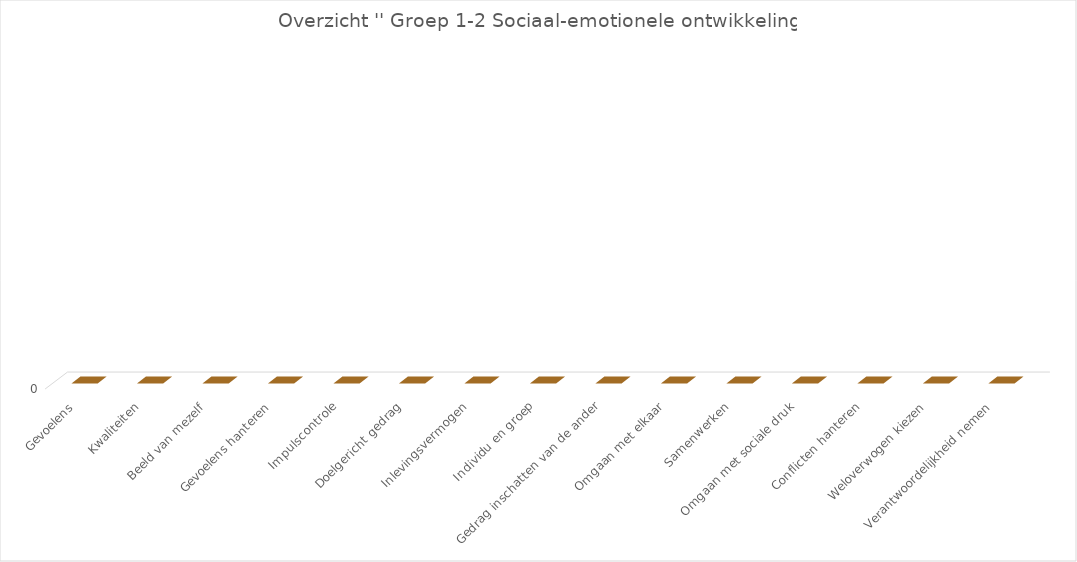
| Category | Series 2 |
|---|---|
| Gevoelens | 0 |
| Kwaliteiten | 0 |
| Beeld van mezelf | 0 |
| Gevoelens hanteren | 0 |
| Impulscontrole | 0 |
| Doelgericht gedrag | 0 |
| Inlevingsvermogen | 0 |
| Individu en groep | 0 |
| Gedrag inschatten van de ander | 0 |
| Omgaan met elkaar | 0 |
| Samenwerken | 0 |
| Omgaan met sociale druk | 0 |
| Conflicten hanteren | 0 |
| Weloverwogen kiezen | 0 |
| Verantwoordelijkheid nemen | 0 |